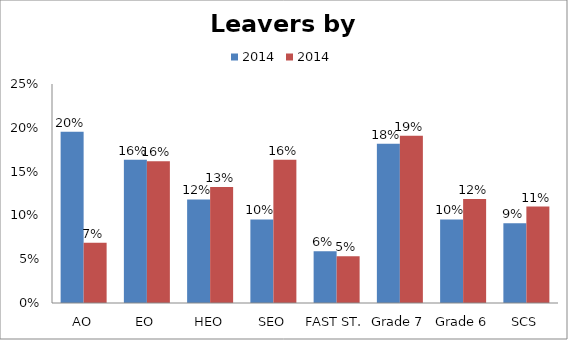
| Category | 2014 |
|---|---|
| AO | 0.069 |
| EO | 0.162 |
| HEO | 0.133 |
| SEO | 0.164 |
| FAST ST. | 0.053 |
| Grade 7 | 0.191 |
| Grade 6 | 0.119 |
| SCS | 0.11 |